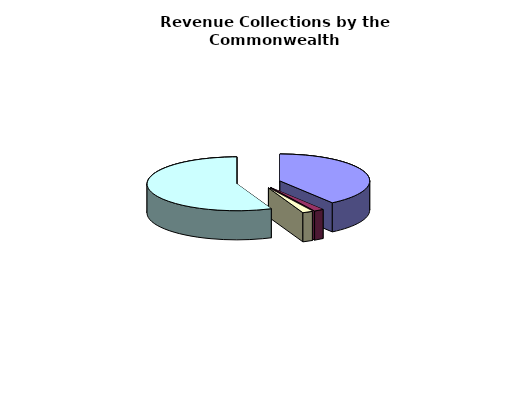
| Category | Series 0 |
|---|---|
| General Fund | 18001810000 |
| Non-General Fund | 799920000 |
| General Fund | 838017000 |
| Non-General Fund | 25273603000 |